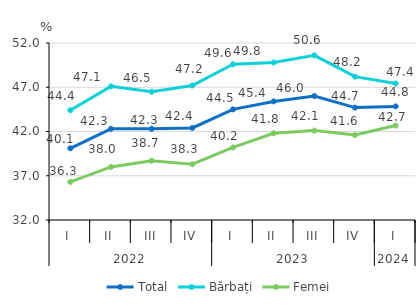
| Category | Total | Bărbați | Femei |
|---|---|---|---|
| 0 | 40.1 | 44.4 | 36.3 |
| 1 | 42.3 | 47.1 | 38 |
| 2 | 42.3 | 46.5 | 38.7 |
| 3 | 42.4 | 47.2 | 38.3 |
| 4 | 44.5 | 49.6 | 40.2 |
| 5 | 45.4 | 49.8 | 41.8 |
| 6 | 46 | 50.6 | 42.1 |
| 7 | 44.7 | 48.2 | 41.6 |
| 8 | 44.838 | 47.429 | 42.67 |